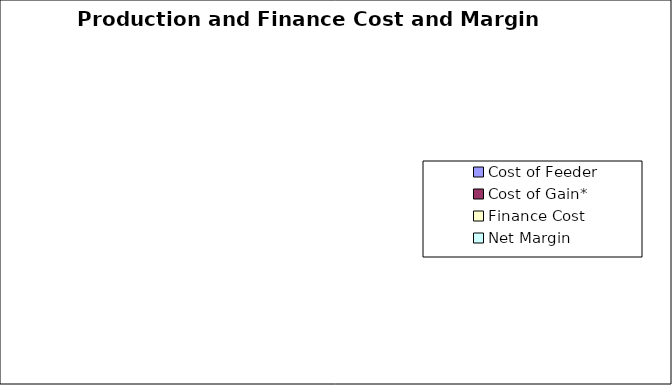
| Category | $/Head |
|---|---|
| Cost of Feeder | 0 |
| Cost of Gain*  | 0 |
| Finance Cost | 0 |
| Net Margin | 0 |